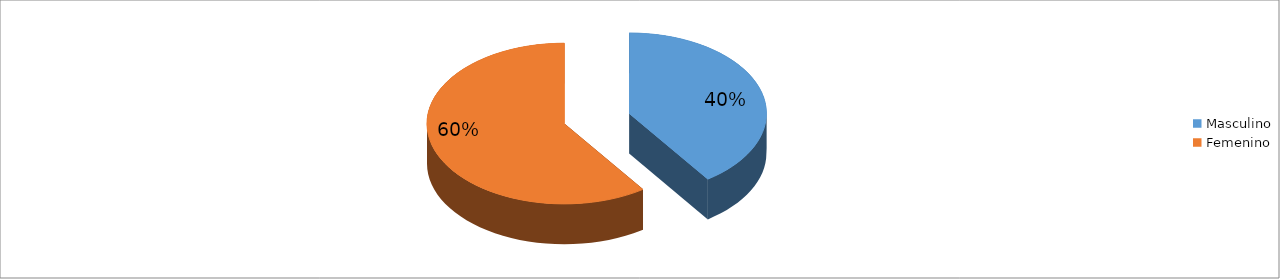
| Category | Series 0 |
|---|---|
| Masculino | 0.403 |
| Femenino | 0.597 |